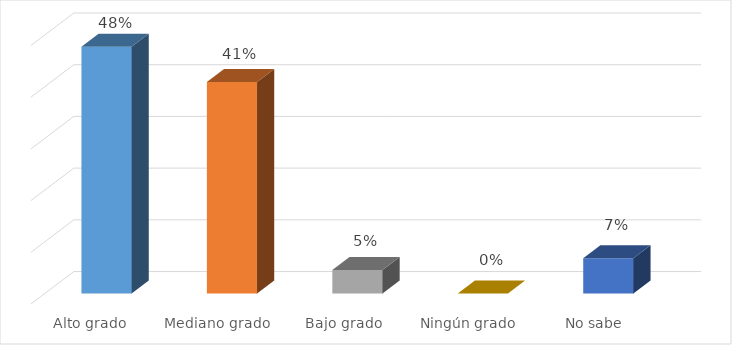
| Category | Series 0 |
|---|---|
| Alto grado  | 0.477 |
| Mediano grado | 0.409 |
| Bajo grado | 0.045 |
| Ningún grado | 0 |
| No sabe | 0.068 |